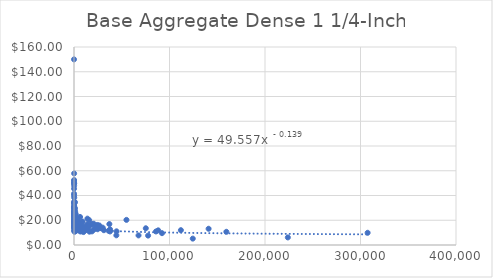
| Category | Base Aggregate Dense 1 1/4-Inch |
|---|---|
| 14.0 | 34.24 |
| 370.0 | 18.59 |
| 160.0 | 14.61 |
| 846.0 | 25.62 |
| 18800.0 | 11 |
| 135.0 | 48 |
| 67.0 | 19.33 |
| 238.0 | 38.24 |
| 2869.0 | 15.75 |
| 1712.0 | 18 |
| 8000.0 | 18.37 |
| 49.0 | 41.44 |
| 480.0 | 19.53 |
| 908.0 | 16.63 |
| 22440.0 | 13.79 |
| 800.0 | 18.92 |
| 120.0 | 21.76 |
| 2450.0 | 15.79 |
| 100.0 | 49.7 |
| 725.0 | 18.13 |
| 1710.0 | 25.2 |
| 15930.0 | 20.04 |
| 27900.0 | 13.74 |
| 370.0 | 27.56 |
| 1510.0 | 15 |
| 82.0 | 19.5 |
| 530.0 | 21.59 |
| 18770.0 | 16.9 |
| 6699.0 | 15.76 |
| 60.0 | 40 |
| 1912.0 | 11.32 |
| 30.0 | 30 |
| 218.0 | 25 |
| 743.0 | 29.29 |
| 3740.0 | 15.4 |
| 77600.0 | 7.6 |
| 6000.0 | 11.41 |
| 365.0 | 30.6 |
| 168.0 | 22.63 |
| 110.0 | 31.75 |
| 560.0 | 29.8 |
| 589.0 | 17.51 |
| 166.0 | 26.07 |
| 130.0 | 23.38 |
| 200.0 | 26.71 |
| 210.0 | 35 |
| 54922.0 | 20.3 |
| 2230.0 | 13.75 |
| 1505.0 | 17 |
| 6399.0 | 12.82 |
| 3704.0 | 13.9 |
| 1012.0 | 13.56 |
| 52.0 | 45.5 |
| 580.0 | 20 |
| 223916.0 | 6.12 |
| 2107.0 | 20.41 |
| 130.0 | 25.5 |
| 37765.0 | 12.64 |
| 720.0 | 16.85 |
| 225.0 | 24.25 |
| 160.0 | 23.57 |
| 7660.0 | 17.51 |
| 135.0 | 24.24 |
| 20.0 | 51.4 |
| 140.0 | 30.55 |
| 460.0 | 22.81 |
| 2159.0 | 15.75 |
| 180.0 | 25.17 |
| 154.0 | 23.4 |
| 26317.0 | 14.75 |
| 150.0 | 23.25 |
| 720.0 | 15.45 |
| 1020.0 | 14.04 |
| 665.0 | 16.82 |
| 238.0 | 21.35 |
| 775.0 | 16.1 |
| 24465.0 | 16.19 |
| 9924.0 | 14.02 |
| 980.0 | 15 |
| 3482.0 | 13.66 |
| 24768.0 | 12.73 |
| 905.0 | 15.48 |
| 14030.0 | 21.29 |
| 8696.0 | 14.82 |
| 450.0 | 23.1 |
| 1000.0 | 15.5 |
| 37710.0 | 10.95 |
| 1030.0 | 14.09 |
| 67564.0 | 7.75 |
| 1191.0 | 21.05 |
| 20919.0 | 12.49 |
| 4432.0 | 13.8 |
| 175.0 | 17.74 |
| 8470.0 | 14.25 |
| 159.0 | 33.4 |
| 44347.0 | 7.82 |
| 190.0 | 29.3 |
| 170.0 | 50 |
| 145.0 | 23.07 |
| 200.0 | 18.1 |
| 1203.0 | 15.09 |
| 648.0 | 22.36 |
| 1777.0 | 17.38 |
| 80.0 | 19.2 |
| 204.0 | 20.07 |
| 14919.0 | 13.67 |
| 170.0 | 14.44 |
| 170.0 | 17.58 |
| 360.0 | 15.67 |
| 350.0 | 20.2 |
| 165.0 | 15 |
| 700.0 | 16 |
| 3070.0 | 16.95 |
| 70.0 | 26.01 |
| 1629.0 | 24.38 |
| 8983.0 | 18.97 |
| 370.0 | 15.36 |
| 6395.0 | 16 |
| 6883.0 | 10.88 |
| 3773.0 | 12.05 |
| 950.0 | 14.57 |
| 600.0 | 12 |
| 16161.0 | 10.77 |
| 4205.0 | 15.7 |
| 866.0 | 21.42 |
| 8070.0 | 12.25 |
| 590.0 | 28.5 |
| 159540.0 | 10.66 |
| 13949.0 | 16.66 |
| 265.0 | 18.3 |
| 484.0 | 15.65 |
| 3472.0 | 14.96 |
| 270.0 | 15.25 |
| 1080.0 | 15.8 |
| 865.0 | 16.5 |
| 620.0 | 16.5 |
| 421.0 | 20.13 |
| 1864.0 | 14.87 |
| 398.0 | 14.5 |
| 6680.0 | 14.96 |
| 36200.0 | 11.52 |
| 307474.0 | 9.87 |
| 75187.0 | 13.52 |
| 7859.0 | 12.93 |
| 44550.0 | 11.04 |
| 213.0 | 11.3 |
| 1510.0 | 14.91 |
| 84.0 | 27.5 |
| 2944.0 | 20.3 |
| 92156.0 | 9.56 |
| 860.0 | 21.54 |
| 6346.0 | 22.65 |
| 1410.0 | 18.1 |
| 37028.0 | 16.91 |
| 640.0 | 10.67 |
| 2725.0 | 16.75 |
| 475.0 | 21.95 |
| 30059.0 | 14 |
| 1270.0 | 19.75 |
| 111921.0 | 11.98 |
| 7800.0 | 13.6 |
| 125.0 | 22.81 |
| 9919.0 | 10.45 |
| 1300.0 | 17 |
| 26555.0 | 15.78 |
| 12000.0 | 15 |
| 17015.0 | 16.06 |
| 1035.0 | 13.07 |
| 508.0 | 15.75 |
| 832.0 | 18.95 |
| 4140.0 | 15.98 |
| 65.0 | 30.8 |
| 804.0 | 21.48 |
| 6930.0 | 17.85 |
| 890.0 | 15.9 |
| 140945.0 | 13.13 |
| 80.0 | 25.83 |
| 160.0 | 14 |
| 141.0 | 57.83 |
| 1396.0 | 23.52 |
| 31299.0 | 11.95 |
| 5873.0 | 15.95 |
| 120.0 | 30 |
| 3858.0 | 13.43 |
| 85808.0 | 10.93 |
| 900.0 | 20.18 |
| 3485.0 | 17.12 |
| 1240.0 | 21.18 |
| 1281.0 | 16.09 |
| 2090.0 | 14.29 |
| 1175.0 | 26.93 |
| 630.0 | 13.95 |
| 4448.0 | 14.8 |
| 993.0 | 17.9 |
| 834.0 | 24.86 |
| 3875.0 | 19.48 |
| 700.0 | 13.55 |
| 579.0 | 18 |
| 948.0 | 34.62 |
| 268.0 | 30 |
| 88143.0 | 11.84 |
| 1234.0 | 14.22 |
| 10609.0 | 13.69 |
| 1769.0 | 18.29 |
| 20680.0 | 17.18 |
| 124373.0 | 5.16 |
| 6230.0 | 13.86 |
| 2031.0 | 16.01 |
| 6289.0 | 14.7 |
| 1439.0 | 22.1 |
| 68.0 | 26.5 |
| 365.0 | 33.92 |
| 315.0 | 18.5 |
| 1085.0 | 21.2 |
| 85.0 | 52.5 |
| 12507.0 | 12.06 |
| 17.0 | 150 |
| 238.0 | 12.53 |